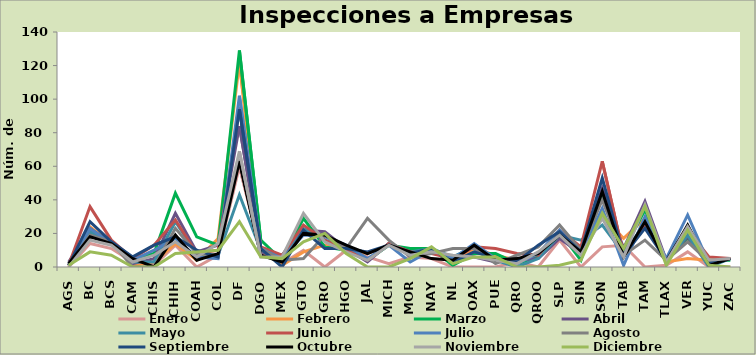
| Category | Enero | Febrero | Marzo | Abril | Mayo | Junio | Julio | Agosto | Septiembre | Octubre | Noviembre | Diciembre |
|---|---|---|---|---|---|---|---|---|---|---|---|---|
| AGS | 0 | 0 | 1 | 3 | 2 | 1 | 1 | 1 | 1 | 2 | 0 | 1 |
| BC | 14 | 24 | 21 | 23 | 21 | 36 | 23 | 19 | 27 | 18 | 16 | 9 |
| BCS | 11 | 14 | 14 | 14 | 15 | 16 | 14 | 15 | 15 | 14 | 13 | 7 |
| CAM | 3 | 1 | 5 | 2 | 3 | 5 | 4 | 0 | 6 | 5 | 3 | 0 |
| CHIS | 1 | 3 | 8 | 5 | 3 | 13 | 10 | 0 | 13 | 0 | 7 | 0 |
| CHIH | 13 | 14 | 44 | 32 | 27 | 28 | 17 | 23 | 18 | 19 | 15 | 8 |
| COAH | 0 | 4 | 18 | 9 | 8 | 8 | 6 | 8 | 10 | 4 | 6 | 9 |
| COL | 7 | 17 | 13 | 13 | 7 | 10 | 5 | 7 | 6 | 8 | 14 | 10 |
| DF | 60 | 122 | 129 | 84 | 43 | 95 | 102 | 64 | 94 | 63 | 69 | 27 |
| DGO | 9 | 10 | 16 | 9 | 10 | 12 | 11 | 11 | 11 | 7 | 6 | 6 |
| MEX | 2 | 1 | 4 | 5 | 7 | 7 | 5 | 4 | 0 | 3 | 6 | 5 |
| GTO | 10 | 9 | 29 | 22 | 23 | 25 | 19 | 5 | 22 | 20 | 32 | 15 |
| GRO | 0 | 13 | 12 | 21 | 16 | 16 | 18 | 19 | 11 | 19 | 15 | 20 |
| HGO | 10 | 10 | 10 | 11 | 12 | 10 | 13 | 11 | 11 | 13 | 9 | 8 |
| JAL | 6 | 8 | 4 | 3 | 4 | 4 | 5 | 29 | 9 | 8 | 4 | 0 |
| MICH | 2 | 13 | 13 | 14 | 14 | 14 | 13 | 16 | 13 | 13 | 13 | 0 |
| MOR | 6 | 10 | 11 | 9 | 9 | 9 | 3 | 6 | 8 | 9 | 7 | 5 |
| NAY | 5 | 10 | 11 | 9 | 11 | 8 | 10 | 8 | 11 | 5 | 9 | 12 |
| NL | 0 | 3 | 1 | 6 | 6 | 5 | 5 | 11 | 3 | 4 | 7 | 2 |
| OAX | 0 | 11 | 8 | 6 | 12 | 12 | 14 | 11 | 9 | 13 | 6 | 6 |
| PUE | 0 | 7 | 8 | 3 | 4 | 11 | 5 | 2 | 5 | 4 | 4 | 6 |
| QRO | 3 | 4 | 2 | 4 | 0 | 8 | 2 | 7 | 3 | 5 | 2 | 0 |
| QROO | 0 | 6 | 6 | 5 | 5 | 7 | 8 | 12 | 13 | 8 | 9 | 0 |
| SLP | 16 | 20 | 21 | 17 | 19 | 22 | 22 | 25 | 21 | 19 | 19 | 1 |
| SIN | 0 | 11 | 4 | 8 | 16 | 12 | 8 | 10 | 9 | 9 | 7 | 4 |
| SON | 12 | 31 | 43 | 47 | 25 | 63 | 35 | 40 | 53 | 45 | 29 | 32 |
| TAB | 13 | 17 | 10 | 11 | 8 | 7 | 1 | 7 | 7 | 6 | 6 | 11 |
| TAM | 0 | 29 | 34 | 39 | 26 | 25 | 30 | 16 | 23 | 27 | 37 | 36 |
| TLAX | 1 | 3 | 4 | 4 | 3 | 5 | 5 | 4 | 4 | 3 | 3 | 1 |
| VER | 9 | 5 | 17 | 18 | 19 | 22 | 31 | 15 | 24 | 25 | 24 | 22 |
| YUC | 0 | 4 | 4 | 1 | 0 | 6 | 2 | 3 | 3 | 1 | 4 | 1 |
| ZAC | 0 | 5 | 4 | 5 | 5 | 5 | 5 | 5 | 5 | 5 | 5 | 0 |